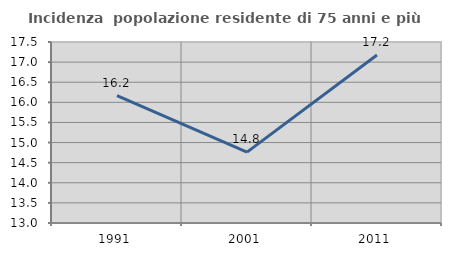
| Category | Incidenza  popolazione residente di 75 anni e più |
|---|---|
| 1991.0 | 16.168 |
| 2001.0 | 14.763 |
| 2011.0 | 17.175 |